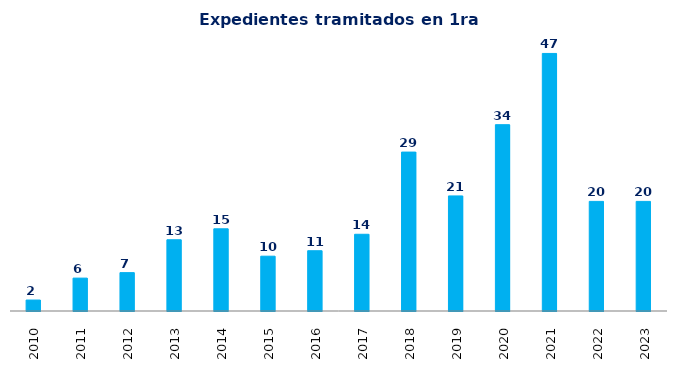
| Category | Series 0 |
|---|---|
| 2010.0 | 2 |
| 2011.0 | 6 |
| 2012.0 | 7 |
| 2013.0 | 13 |
| 2014.0 | 15 |
| 2015.0 | 10 |
| 2016.0 | 11 |
| 2017.0 | 14 |
| 2018.0 | 29 |
| 2019.0 | 21 |
| 2020.0 | 34 |
| 2021.0 | 47 |
| 2022.0 | 20 |
| 2023.0 | 20 |